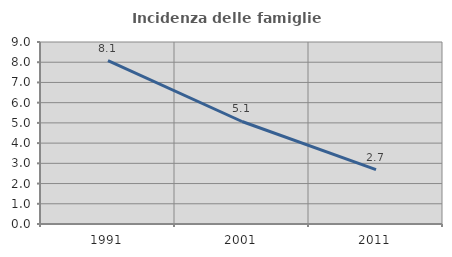
| Category | Incidenza delle famiglie numerose |
|---|---|
| 1991.0 | 8.076 |
| 2001.0 | 5.069 |
| 2011.0 | 2.689 |